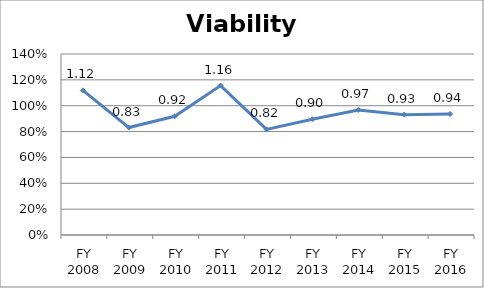
| Category | Viability ratio |
|---|---|
| FY 2016 | 0.936 |
| FY 2015 | 0.931 |
| FY 2014 | 0.967 |
| FY 2013 | 0.896 |
| FY 2012 | 0.817 |
| FY 2011 | 1.156 |
| FY 2010 | 0.918 |
| FY 2009 | 0.831 |
| FY 2008 | 1.119 |